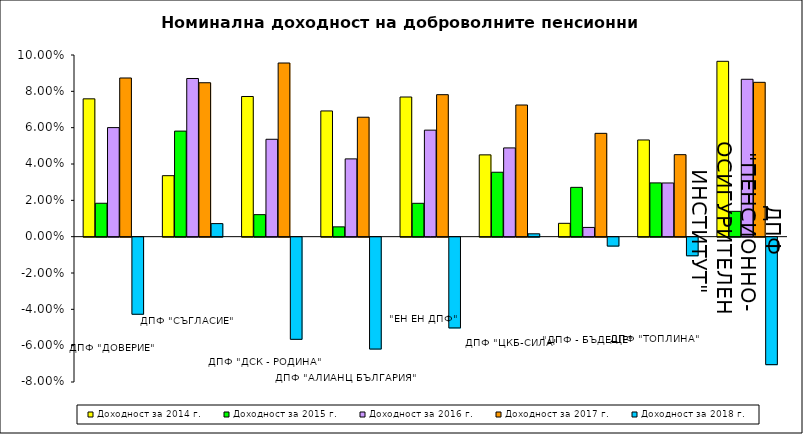
| Category | Доходност за 2014 г. | Доходност за 2015 г. | Доходност за 2016 г. | Доходност за 2017 г. | Доходност за 2018 г. |
|---|---|---|---|---|---|
| ДПФ "ДОВЕРИЕ"  | 0.076 | 0.018 | 0.06 | 0.087 | -0.042 |
| ДПФ "СЪГЛАСИЕ"  | 0.034 | 0.058 | 0.087 | 0.085 | 0.007 |
| ДПФ "ДСК - РОДИНА" | 0.077 | 0.012 | 0.054 | 0.096 | -0.056 |
| ДПФ "АЛИАНЦ БЪЛГАРИЯ" | 0.069 | 0.005 | 0.043 | 0.066 | -0.062 |
| "ЕН ЕН ДПФ" | 0.077 | 0.018 | 0.059 | 0.078 | -0.05 |
| ДПФ "ЦКБ-СИЛА" | 0.045 | 0.035 | 0.049 | 0.072 | 0.002 |
| "ДПФ - БЪДЕЩЕ" | 0.007 | 0.027 | 0.005 | 0.057 | -0.005 |
| ДПФ "ТОПЛИНА" | 0.053 | 0.03 | 0.03 | 0.045 | -0.01 |
| ДПФ "ПЕНСИОННООСИГУРИТЕЛЕН ИНСТИТУТ" | 0.097 | 0.014 | 0.087 | 0.085 | -0.07 |